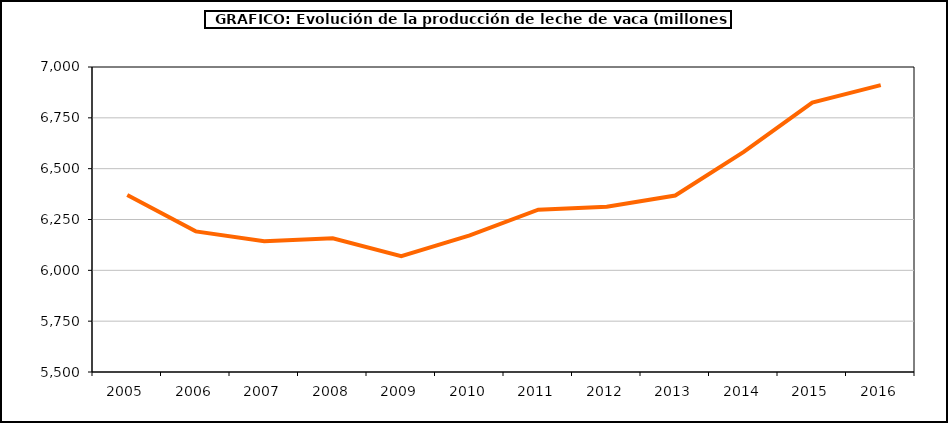
| Category | leche vaca |
|---|---|
| 2005.0 | 6370.202 |
| 2006.0 | 6191.682 |
| 2007.0 | 6143.128 |
| 2008.0 | 6157.188 |
| 2009.0 | 6069.364 |
| 2010.0 | 6171.9 |
| 2011.0 | 6298.47 |
| 2012.0 | 6313.014 |
| 2013.0 | 6368.131 |
| 2014.0 | 6582.284 |
| 2015.0 | 6825.141 |
| 2016.0 | 6910.608 |